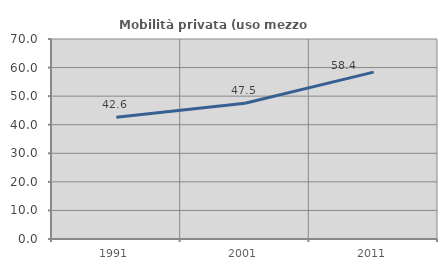
| Category | Mobilità privata (uso mezzo privato) |
|---|---|
| 1991.0 | 42.589 |
| 2001.0 | 47.519 |
| 2011.0 | 58.4 |